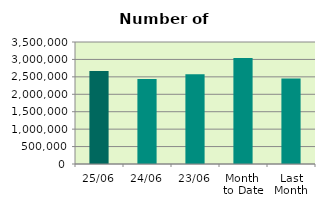
| Category | Series 0 |
|---|---|
| 25/06 | 2665336 |
| 24/06 | 2441958 |
| 23/06 | 2574434 |
| Month 
to Date | 3037653.684 |
| Last
Month | 2451339.2 |